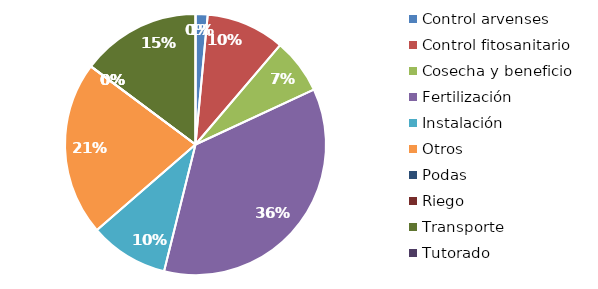
| Category | Valor |
|---|---|
| Control arvenses | 3299850 |
| Control fitosanitario | 21481170 |
| Cosecha y beneficio | 15115594.114 |
| Fertilización | 78973155 |
| Instalación | 21525872.246 |
| Otros | 47619210 |
| Podas | 0 |
| Riego | 0 |
| Transporte | 32646939 |
| Tutorado | 0 |